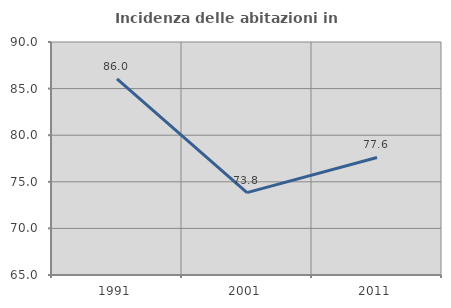
| Category | Incidenza delle abitazioni in proprietà  |
|---|---|
| 1991.0 | 86.04 |
| 2001.0 | 73.843 |
| 2011.0 | 77.612 |